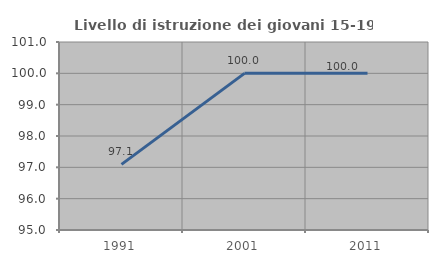
| Category | Livello di istruzione dei giovani 15-19 anni |
|---|---|
| 1991.0 | 97.093 |
| 2001.0 | 100 |
| 2011.0 | 100 |